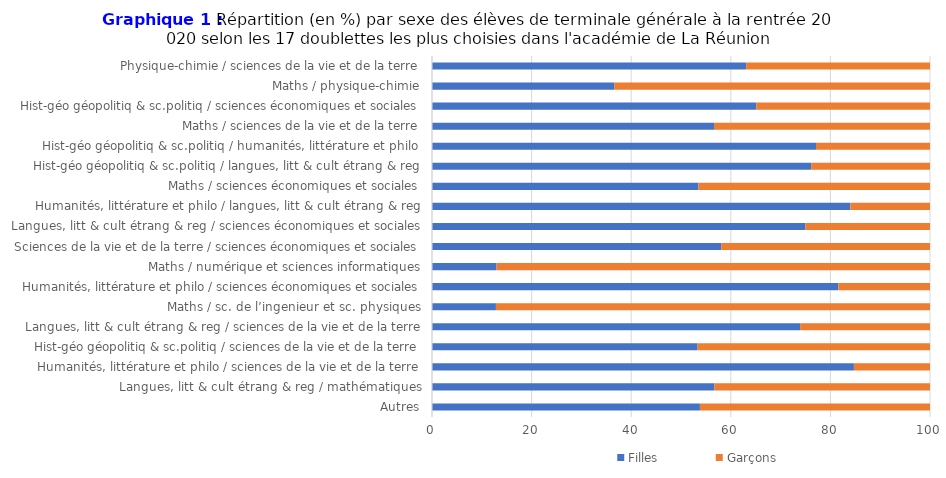
| Category | Filles | Garçons |
|---|---|---|
| Autres | 53.8 | 46.2 |
| Langues, litt & cult étrang & reg / mathématiques | 56.716 | 43.284 |
| Humanités, littérature et philo / sciences de la vie et de la terre | 84.722 | 15.278 |
| Hist-géo géopolitiq & sc.politiq / sciences de la vie et de la terre | 53.333 | 46.667 |
| Langues, litt & cult étrang & reg / sciences de la vie et de la terre | 73.913 | 26.087 |
| Maths / sc. de l’ingenieur et sc. physiques | 12.838 | 87.162 |
| Humanités, littérature et philo / sciences économiques et sociales | 81.579 | 18.421 |
| Maths / numérique et sciences informatiques | 12.963 | 87.037 |
| Sciences de la vie et de la terre / sciences économiques et sociales | 58.084 | 41.916 |
| Langues, litt & cult étrang & reg / sciences économiques et sociales | 75 | 25 |
| Humanités, littérature et philo / langues, litt & cult étrang & reg | 84 | 16 |
| Maths / sciences économiques et sociales | 53.498 | 46.502 |
| Hist-géo géopolitiq & sc.politiq / langues, litt & cult étrang & reg | 76.136 | 23.864 |
| Hist-géo géopolitiq & sc.politiq / humanités, littérature et philo | 77.113 | 22.887 |
| Maths / sciences de la vie et de la terre | 56.629 | 43.371 |
| Hist-géo géopolitiq & sc.politiq / sciences économiques et sociales | 65.125 | 34.875 |
| Maths / physique-chimie | 36.585 | 63.415 |
| Physique-chimie / sciences de la vie et de la terre | 63.088 | 36.912 |